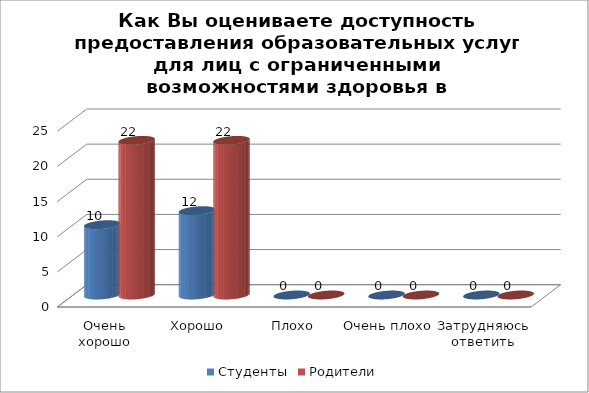
| Category | Студенты | Родители |
|---|---|---|
| Очень хорошо | 10 | 22 |
| Хорошо | 12 | 22 |
| Плохо | 0 | 0 |
| Очень плохо | 0 | 0 |
| Затрудняюсь ответить | 0 | 0 |